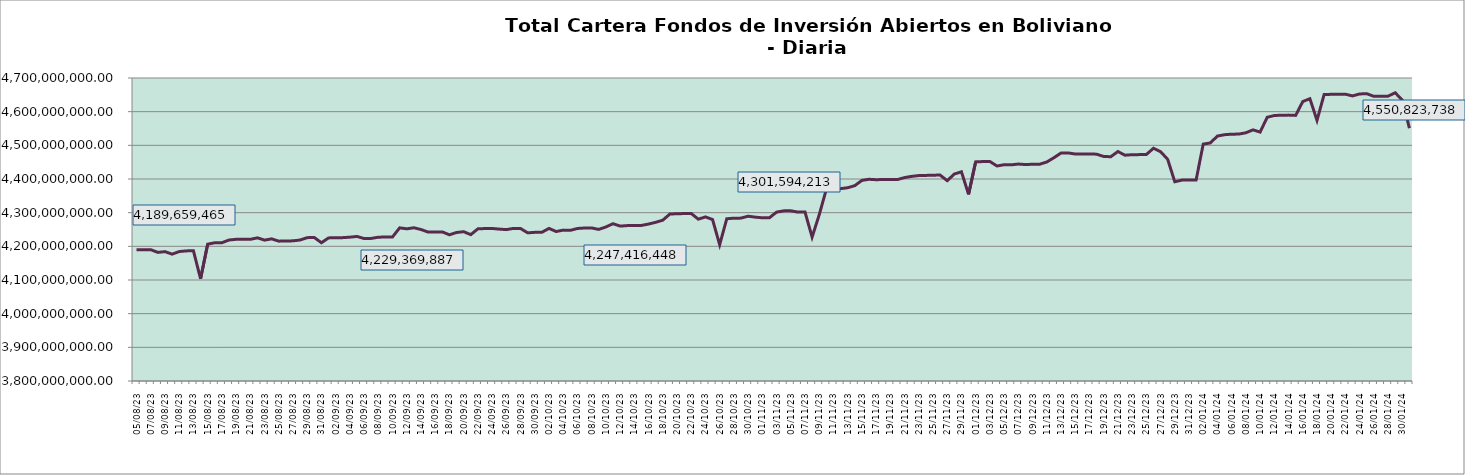
| Category | Cartera |
|---|---|
| 2023-08-05 | 4189659464.87 |
| 2023-08-06 | 4189829925.45 |
| 2023-08-07 | 4189997926.39 |
| 2023-08-08 | 4182013840.75 |
| 2023-08-09 | 4184244274.94 |
| 2023-08-10 | 4176804528.9 |
| 2023-08-11 | 4184479961.39 |
| 2023-08-12 | 4186483542.9 |
| 2023-08-13 | 4186665210.29 |
| 2023-08-14 | 4103514129.2 |
| 2023-08-15 | 4206353895.49 |
| 2023-08-16 | 4210672529.8 |
| 2023-08-17 | 4210754155.33 |
| 2023-08-18 | 4218713701.53 |
| 2023-08-19 | 4220833367.62 |
| 2023-08-20 | 4221001552.47 |
| 2023-08-21 | 4220802613.47 |
| 2023-08-22 | 4225243261.51 |
| 2023-08-23 | 4218450717.82 |
| 2023-08-24 | 4222200191.94 |
| 2023-08-25 | 4215374375.49 |
| 2023-08-26 | 4216013726.39 |
| 2023-08-27 | 4216249329.15 |
| 2023-08-28 | 4218832957.71 |
| 2023-08-29 | 4225826732.84 |
| 2023-08-30 | 4226083207.61 |
| 2023-08-31 | 4210660955.15 |
| 2023-09-01 | 4225037532.44 |
| 2023-09-02 | 4225665290.26 |
| 2023-09-03 | 4225837782.96 |
| 2023-09-04 | 4227240249.25 |
| 2023-09-05 | 4229369887.25 |
| 2023-09-06 | 4223134189.63 |
| 2023-09-07 | 4223572973.05 |
| 2023-09-08 | 4227031396.42 |
| 2023-09-09 | 4227828115.47 |
| 2023-09-10 | 4227998265.07 |
| 2023-09-11 | 4254934059.22 |
| 2023-09-12 | 4251997659.89 |
| 2023-09-13 | 4255168121.96 |
| 2023-09-14 | 4249945741.98 |
| 2023-09-15 | 4242376110.43 |
| 2023-09-16 | 4242697978.39 |
| 2023-09-17 | 4242873084.15 |
| 2023-09-18 | 4234198831.63 |
| 2023-09-19 | 4241122644.1 |
| 2023-09-20 | 4243478115.99 |
| 2023-09-21 | 4234723410.56 |
| 2023-09-22 | 4251990813.6 |
| 2023-09-23 | 4252824802.38 |
| 2023-09-24 | 4253001324.64 |
| 2023-09-25 | 4251195146.31 |
| 2023-09-26 | 4249614122.72 |
| 2023-09-27 | 4253275776.12 |
| 2023-09-28 | 4252923490.36 |
| 2023-09-29 | 4240084259.46 |
| 2023-09-30 | 4241550326.26 |
| 2023-10-01 | 4241740015.55 |
| 2023-10-02 | 4253251683.8 |
| 2023-10-03 | 4244025028.9 |
| 2023-10-04 | 4248160567.43 |
| 2023-10-05 | 4247416448.27 |
| 2023-10-06 | 4253046297.14 |
| 2023-10-07 | 4254432875.57 |
| 2023-10-08 | 4254607816.99 |
| 2023-10-09 | 4250276298.22 |
| 2023-10-10 | 4257566355.66 |
| 2023-10-11 | 4267208349.57 |
| 2023-10-12 | 4260077291.27 |
| 2023-10-13 | 4261575395.82 |
| 2023-10-14 | 4261984257.98 |
| 2023-10-15 | 4262148121.72 |
| 2023-10-16 | 4266161012.53 |
| 2023-10-17 | 4271338439.98 |
| 2023-10-18 | 4277700920.1 |
| 2023-10-19 | 4295989286.49 |
| 2023-10-20 | 4296752483 |
| 2023-10-21 | 4297352768.14 |
| 2023-10-22 | 4297515758.63 |
| 2023-10-23 | 4280664793.45 |
| 2023-10-24 | 4287408973.45 |
| 2023-10-25 | 4279614406.75 |
| 2023-10-26 | 4204785195.17 |
| 2023-10-27 | 4281961612.99 |
| 2023-10-28 | 4283622242.24 |
| 2023-10-29 | 4283803811.07 |
| 2023-10-30 | 4289506540.61 |
| 2023-10-31 | 4286689692.19 |
| 2023-11-01 | 4284761280.38 |
| 2023-11-02 | 4284889038.22 |
| 2023-11-03 | 4301594212.59 |
| 2023-11-04 | 4305374107 |
| 2023-11-05 | 4305557747.44 |
| 2023-11-06 | 4301691364.38 |
| 2023-11-07 | 4301975072.92 |
| 2023-11-08 | 4227421817.51 |
| 2023-11-09 | 4293799971.52 |
| 2023-11-10 | 4369428468.75 |
| 2023-11-11 | 4371160358 |
| 2023-11-12 | 4371321552.44 |
| 2023-11-13 | 4374036488.01 |
| 2023-11-14 | 4380249168.59 |
| 2023-11-15 | 4395825155.76 |
| 2023-11-16 | 4399190209.36 |
| 2023-11-17 | 4397887887.33 |
| 2023-11-18 | 4398579844.36 |
| 2023-11-19 | 4398759308.67 |
| 2023-11-20 | 4398296510.09 |
| 2023-11-21 | 4404236003.53 |
| 2023-11-22 | 4407786452.76 |
| 2023-11-23 | 4410199675.83 |
| 2023-11-24 | 4410645721.9 |
| 2023-11-25 | 4411427855.31 |
| 2023-11-26 | 4411608567.59 |
| 2023-11-27 | 4395009258.51 |
| 2023-11-28 | 4414758140.09 |
| 2023-11-29 | 4421448911.02 |
| 2023-11-30 | 4354375325.07 |
| 2023-12-01 | 4450921375.8 |
| 2023-12-02 | 4451765891.18 |
| 2023-12-03 | 4451960745.03 |
| 2023-12-04 | 4438628762.86 |
| 2023-12-05 | 4442441869.92 |
| 2023-12-06 | 4442103984.82 |
| 2023-12-07 | 4444373478.95 |
| 2023-12-08 | 4442992657.54 |
| 2023-12-09 | 4443749468.74 |
| 2023-12-10 | 4443952228.26 |
| 2023-12-11 | 4450460471.99 |
| 2023-12-12 | 4463148794.27 |
| 2023-12-13 | 4477168995.04 |
| 2023-12-14 | 4477485456.63 |
| 2023-12-15 | 4474197441.85 |
| 2023-12-16 | 4474368223.63 |
| 2023-12-17 | 4474578959.2 |
| 2023-12-18 | 4473710709.35 |
| 2023-12-19 | 4466995308.19 |
| 2023-12-20 | 4466150193.08 |
| 2023-12-21 | 4481596686.48 |
| 2023-12-22 | 4470675674.26 |
| 2023-12-23 | 4472212249.11 |
| 2023-12-24 | 4472423094.28 |
| 2023-12-25 | 4472637527.95 |
| 2023-12-26 | 4491312389.91 |
| 2023-12-27 | 4481184198.47 |
| 2023-12-28 | 4458449001.93 |
| 2023-12-29 | 4391809437.69 |
| 2023-12-30 | 4396686145.28 |
| 2023-12-31 | 4396909800.84 |
| 2024-01-01 | 4397094688.27 |
| 2024-01-02 | 4503689125.25 |
| 2024-01-03 | 4507204789.14 |
| 2024-01-04 | 4527583774.87 |
| 2024-01-05 | 4531577164.52 |
| 2024-01-06 | 4533169857.12 |
| 2024-01-07 | 4533378412.66 |
| 2024-01-08 | 4537365783.81 |
| 2024-01-09 | 4545988866.04 |
| 2024-01-10 | 4539378051.72 |
| 2024-01-11 | 4583359893.41 |
| 2024-01-12 | 4588540598.04 |
| 2024-01-13 | 4589539655.95 |
| 2024-01-14 | 4589749702.61 |
| 2024-01-15 | 4588925556.92 |
| 2024-01-16 | 4630097233.87 |
| 2024-01-17 | 4638514769.31 |
| 2024-01-18 | 4574256747.36 |
| 2024-01-19 | 4650846364.78 |
| 2024-01-20 | 4651477250.49 |
| 2024-01-21 | 4651686748.85 |
| 2024-01-22 | 4651863757.22 |
| 2024-01-23 | 4646774540.97 |
| 2024-01-24 | 4652618964.58 |
| 2024-01-25 | 4653398203.04 |
| 2024-01-26 | 4645439951.76 |
| 2024-01-27 | 4645914265.38 |
| 2024-01-28 | 4646125784.39 |
| 2024-01-29 | 4656158639.22 |
| 2024-01-30 | 4634079821.17 |
| 2024-01-31 | 4550823737.79 |